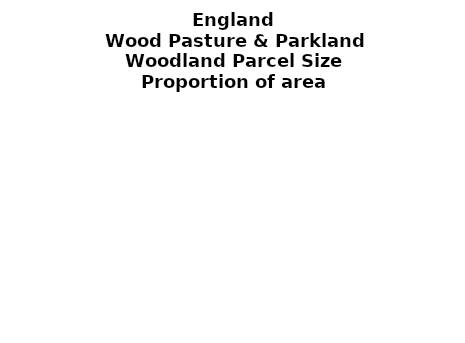
| Category | Wood Pasture & Parkland |
|---|---|
| <5 ha | 0.303 |
| ≥5 and <10 ha | 0.078 |
| ≥10 and <15 ha | 0.036 |
| ≥15 and <20 ha | 0.022 |
| ≥20 and <25 ha | 0.006 |
| ≥25 and <30 ha | 0.008 |
| ≥30 and <35 ha | 0.03 |
| ≥35 and <40 ha | 0 |
| ≥40 and <45 ha | 0.014 |
| ≥45 and <50 ha | 0 |
| ≥50 and <60 ha | 0.013 |
| ≥60 and <70 ha | 0.028 |
| ≥70 and <80 ha | 0.059 |
| ≥80 and <90 ha | 0 |
| ≥90 and <100 ha | 0.007 |
| ≥100 and <150 ha | 0.026 |
| ≥150 and <200 ha | 0.037 |
| ≥200 ha | 0.331 |